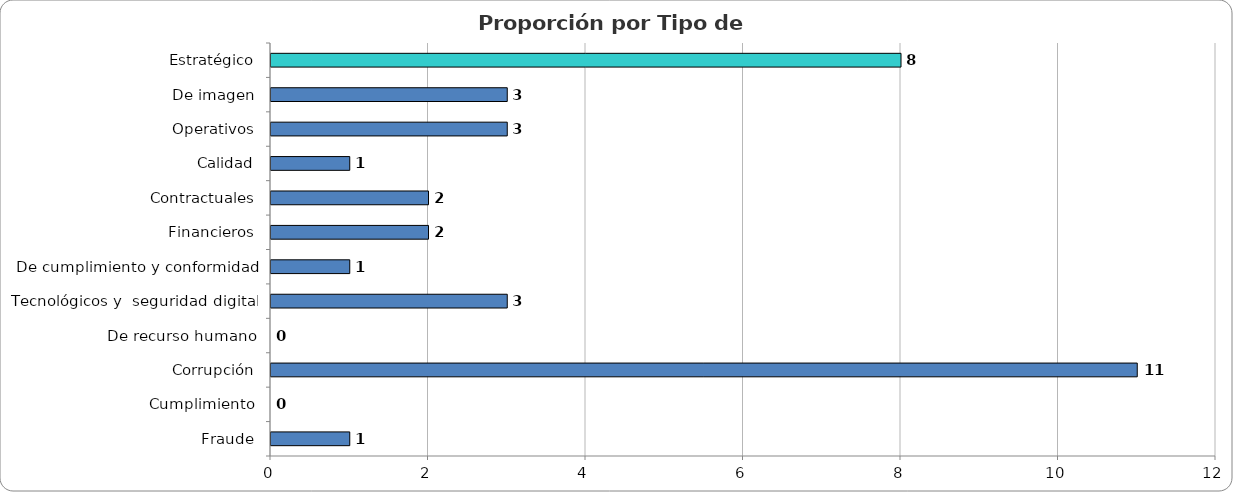
| Category | Series 0 |
|---|---|
| Estratégico | 8 |
| De imagen | 3 |
| Operativos | 3 |
| Calidad | 1 |
| Contractuales | 2 |
| Financieros | 2 |
| De cumplimiento y conformidad | 1 |
| Tecnológicos y  seguridad digital | 3 |
| De recurso humano | 0 |
| Corrupción | 11 |
| Cumplimiento | 0 |
| Fraude | 1 |